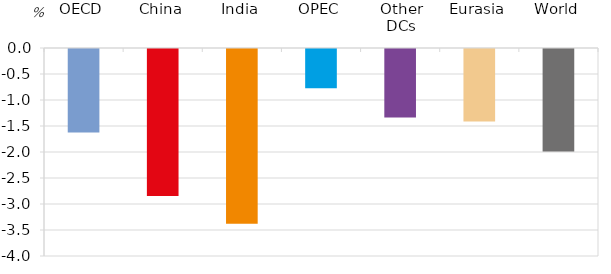
| Category | Series 0 |
|---|---|
| OECD | -1.607 |
| China | -2.828 |
| India | -3.36 |
| OPEC | -0.754 |
| Other DCs | -1.317 |
| Eurasia | -1.395 |
| World | -1.972 |